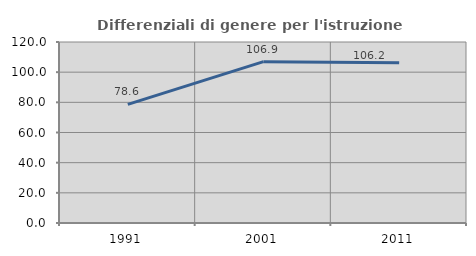
| Category | Differenziali di genere per l'istruzione superiore |
|---|---|
| 1991.0 | 78.613 |
| 2001.0 | 106.946 |
| 2011.0 | 106.224 |